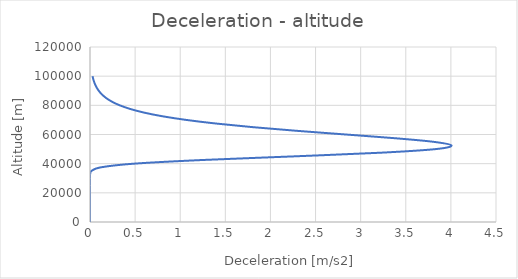
| Category | Series 0 |
|---|---|
| 0.027889874338090925 | 100000 |
| 0.038085065369143654 | 97500 |
| 0.05198916728356236 | 95000 |
| 0.07093588685818294 | 92500 |
| 0.0967250409999859 | 90000 |
| 0.13177372552757197 | 87500 |
| 0.17930615740509975 | 85000 |
| 0.243582459551541 | 82500 |
| 0.3301556618579106 | 80000 |
| 0.44612301075319527 | 77500 |
| 0.6002929245519382 | 75000 |
| 0.8031085245642858 | 72500 |
| 1.0660349611036957 | 70000 |
| 1.3999178452729157 | 67500 |
| 1.811572982634669 | 65000 |
| 2.297691295518684 | 62500 |
| 2.8353860155976887 | 60000 |
| 3.3701278929709715 | 57500 |
| 3.805570787083488 | 55000 |
| 4.006511248630581 | 52500 |
| 3.832872216589341 | 50000 |
| 3.2168992207070697 | 47500 |
| 2.2576304800847993 | 45000 |
| 1.2407037230281415 | 42500 |
| 0.48811806100840505 | 40000 |
| 0.12161121146450381 | 37500 |
| 0.016226718251350733 | 35000 |
| 0.0009221736958756313 | 32500 |
| 1.6320822759489827e-05 | 30000 |
| 5.863530800193402e-08 | 27500 |
| 2.3824537778736793e-11 | 25000 |
| 4.921604610882245e-16 | 22500 |
| 1.7329946289788194e-22 | 20000 |
| 2.3355156745019623e-31 | 17500 |
| 1.5637871305819313e-43 | 15000 |
| 3.193198933814163e-60 | 12500 |
| 4.385111668256398e-83 | 10000 |
| 2.203992851409311e-114 | 7500 |
| 3.258944984166797e-157 | 5000 |
| 8.345259700887844e-216 | 2500 |
| 6.114782005697959e-296 | 0 |